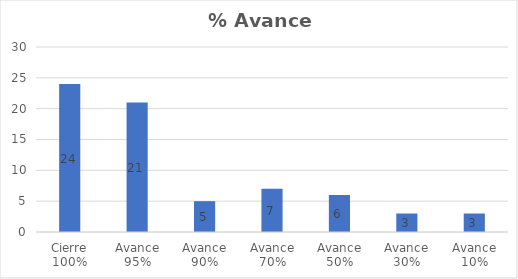
| Category | Series 0 |
|---|---|
| Cierre 100% | 24 |
| Avance 95% | 21 |
| Avance 90% | 5 |
| Avance 70% | 7 |
| Avance 50% | 6 |
| Avance 30% | 3 |
| Avance 10% | 3 |